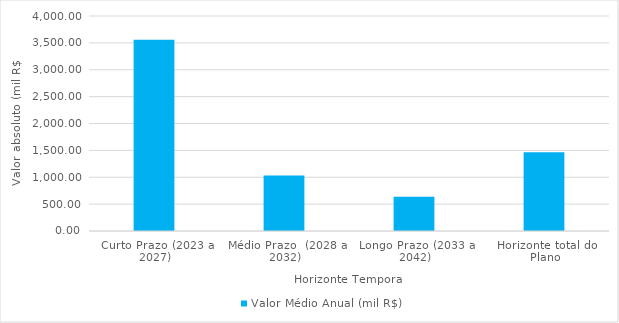
| Category | Valor Médio Anual (mil R$) |
|---|---|
| Curto Prazo (2023 a 2027) | 3555.875 |
| Médio Prazo  (2028 a 2032) | 1032.078 |
| Longo Prazo (2033 a 2042) | 638.121 |
| Horizonte total do Plano | 1466.049 |